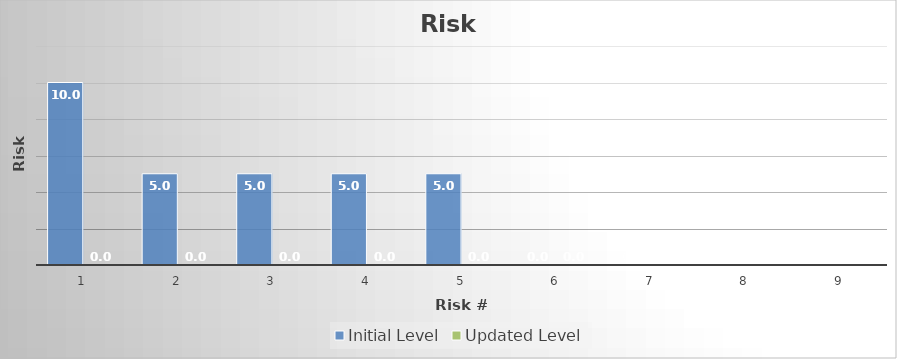
| Category | Initial Level | Updated Level |
|---|---|---|
| 0 | 10 | 0 |
| 1 | 5 | 0 |
| 2 | 5 | 0 |
| 3 | 5 | 0 |
| 4 | 5 | 0 |
| 5 | 0 | 0 |
| 6 | 0 | 0 |
| 7 | 0 | 0 |
| 8 | 0 | 0 |